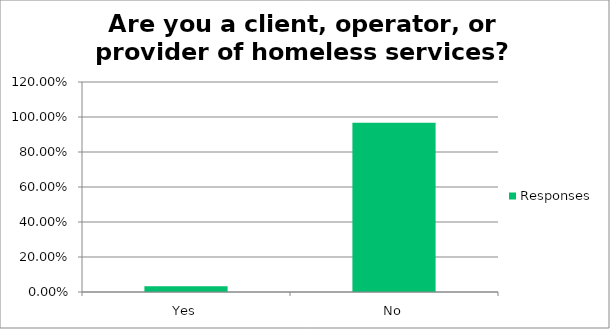
| Category | Responses |
|---|---|
| Yes | 0.032 |
| No | 0.968 |